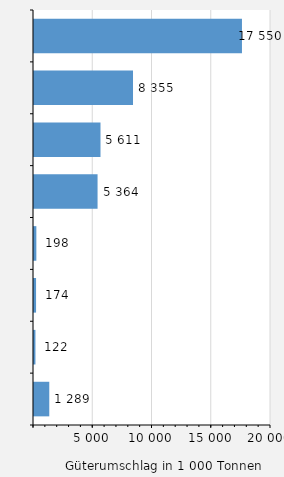
| Category | Güterumschlag |
|---|---|
| Lübeck | 17550 |
| Brunsbüttel | 8355 |
| Puttgarden / Fehmarn | 5611 |
| Kiel | 5364 |
| Dagebüll | 198 |
| Föhr | 174 |
| List / Sylt | 122 |
| Sonstige Häfen | 1289 |